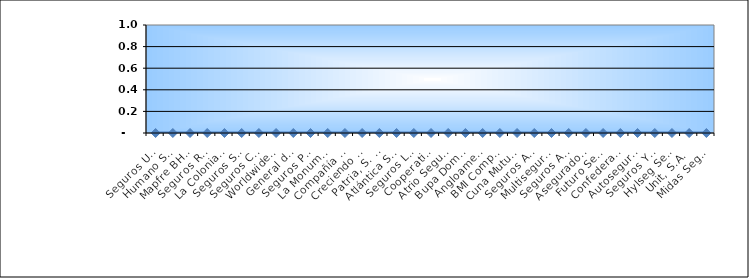
| Category | Series 0 |
|---|---|
| Seguros Universal, S. A. | 0 |
| Humano Seguros, S. A. | 0 |
| Mapfre BHD Compañía de Seguros | 0 |
| Seguros Reservas, S. A. | 0 |
| La Colonial, S. A., Compañia De Seguros | 0 |
| Seguros Sura, S.A. | 0 |
| Seguros Crecer, S. A. | 0 |
| Worldwide Seguros, S. A. | 0 |
| General de Seguros, S. A. | 0 |
| Seguros Pepín, S. A. | 0 |
| La Monumental de Seguros, S. A. | 0 |
| Compañía Dominicana de Seguros, C. por A. | 0 |
| Creciendo Seguros | 0 |
| Patria, S. A., Compañía de Seguros | 0 |
| Atlántica Seguros, S. A. | 0 |
| Seguros La Internacional, S. A. | 0 |
| Cooperativa Nacional De Seguros, Inc  | 0 |
| Atrio Seguros S. A. | 0 |
| Bupa Dominicana, S. A. | 0 |
| Angloamericana de Seguros, S. A. | 0 |
| BMI Compañía de Seguros, S. A. | 0 |
| Cuna Mutual Insurance Society Dominicana | 0 |
| Seguros APS, S.R.L. | 0 |
| Multiseguros Su, S.A. | 0 |
| Seguros Ademi, S.A. | 0 |
| Aseguradora Agropecuaria Dominicana, S. A. | 0 |
| Futuro Seguros | 0 |
| Confederación del Canadá Dominicana, S. A. | 0 |
| Autoseguro, S. A. | 0 |
| Seguros Yunen, S.A. | 0 |
| Hylseg Seguros S.A | 0 |
| Unit, S.A. | 0 |
| Midas Seguros, S.A. | 0 |